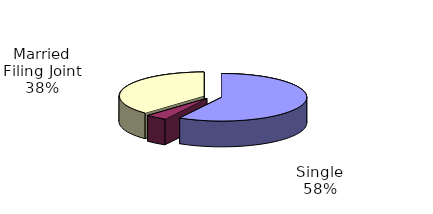
| Category | Series 0 |
|---|---|
| Single | 2322296 |
| Married Filing Separate | 161101 |
| Married Filing Joint | 1506426 |